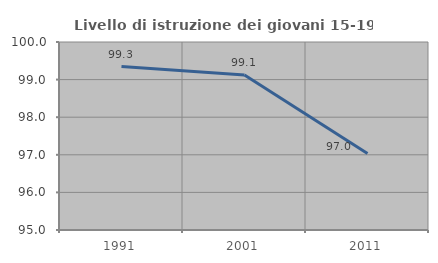
| Category | Livello di istruzione dei giovani 15-19 anni |
|---|---|
| 1991.0 | 99.346 |
| 2001.0 | 99.123 |
| 2011.0 | 97.034 |